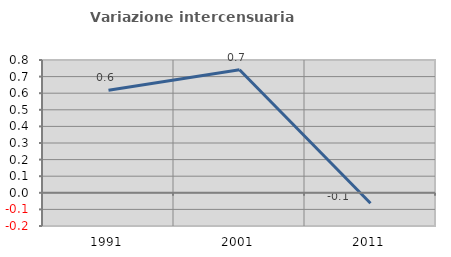
| Category | Variazione intercensuaria annua |
|---|---|
| 1991.0 | 0.618 |
| 2001.0 | 0.742 |
| 2011.0 | -0.063 |